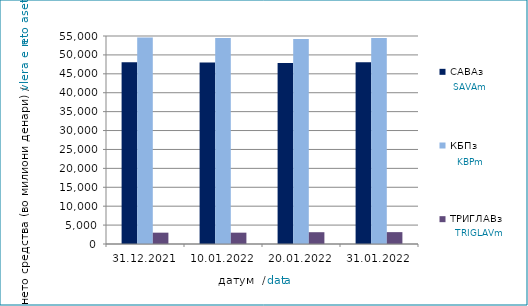
| Category | САВАз | КБПз | ТРИГЛАВз |
|---|---|---|---|
| 2021-12-31 | 48059.628 | 54605.42 | 2996.679 |
| 2022-01-10 | 47977.138 | 54450.179 | 2997.47 |
| 2022-01-20 | 47851.204 | 54174.241 | 3118.605 |
| 2022-01-31 | 48028.745 | 54443.135 | 3136.806 |